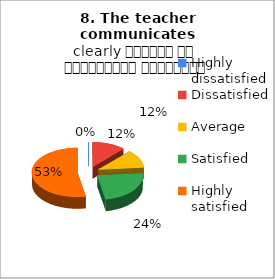
| Category | 8. The teacher communicates clearly शिक्षक का सम्प्रेषण सुस्पष्ट है |
|---|---|
| Highly dissatisfied | 0 |
| Dissatisfied | 2 |
| Average | 2 |
| Satisfied | 4 |
| Highly satisfied | 9 |